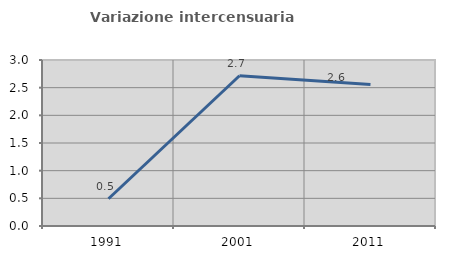
| Category | Variazione intercensuaria annua |
|---|---|
| 1991.0 | 0.492 |
| 2001.0 | 2.715 |
| 2011.0 | 2.557 |